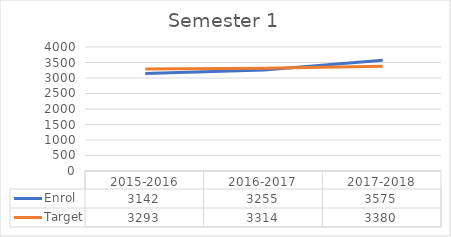
| Category | Enrol | Target |
|---|---|---|
| 2015-2016 | 3142 | 3293 |
| 2016-2017 | 3255 | 3314 |
| 2017-2018 | 3575 | 3380 |